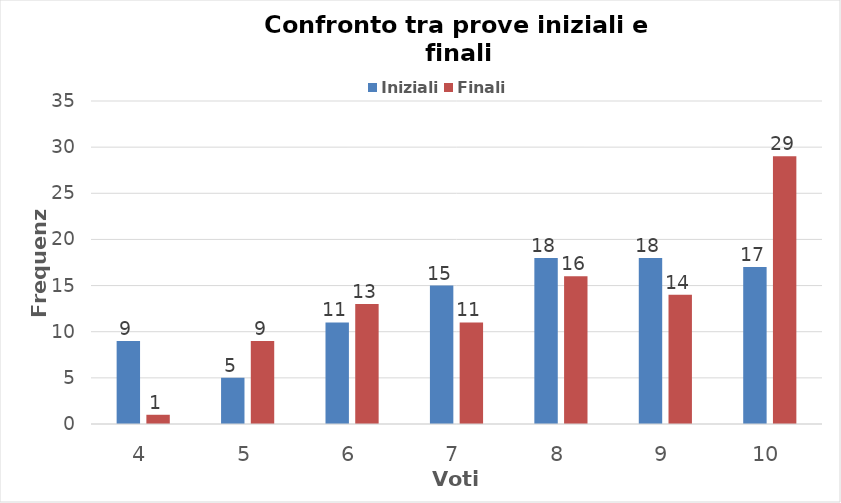
| Category | Iniziali | Finali |
|---|---|---|
| 4.0 | 9 | 1 |
| 5.0 | 5 | 9 |
| 6.0 | 11 | 13 |
| 7.0 | 15 | 11 |
| 8.0 | 18 | 16 |
| 9.0 | 18 | 14 |
| 10.0 | 17 | 29 |